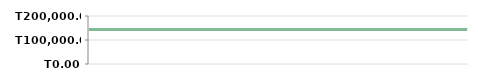
| Category | ЖЫЛ  |
|---|---|
| 2013-04-23 | 143800 |
| 2013-04-25 | 143800 |
| 2013-05-07 | 143800 |
| 2013-05-14 | 143800 |
| 2013-05-14 | 143800 |
| 2013-05-29 | 143800 |
| 2013-06-10 | 143800 |
| 2013-06-21 | 143800 |
| 2013-07-06 | 143800 |
| 2013-08-05 | 143800 |
| 2013-08-19 | 143800 |
| 2013-09-04 | 143800 |
| 2013-09-20 | 143800 |
| 2013-09-25 | 143800 |
| 2013-10-15 | 143800 |
| 2013-11-05 | 143800 |
| 2013-11-26 | 143800 |
| 2013-11-30 | 143800 |
| 2013-12-11 | 143800 |